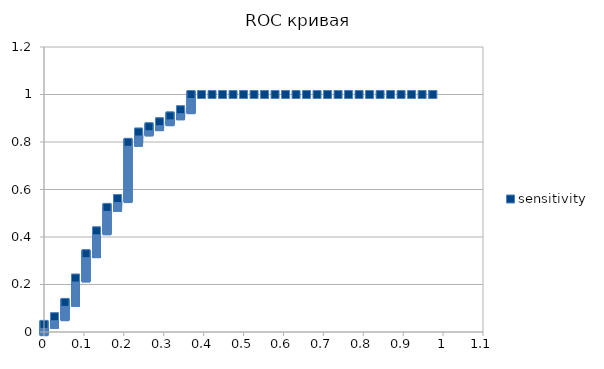
| Category | sensitivity |
|---|---|
| 0.0 | 0.001 |
| 0.0 | 0.002 |
| 0.0 | 0.004 |
| 0.0 | 0.005 |
| 0.0 | 0.006 |
| 0.0 | 0.007 |
| 0.0 | 0.009 |
| 0.0 | 0.01 |
| 0.0 | 0.011 |
| 0.0 | 0.012 |
| 0.0 | 0.014 |
| 0.0 | 0.015 |
| 0.0 | 0.016 |
| 0.0 | 0.017 |
| 0.0 | 0.019 |
| 0.0 | 0.02 |
| 0.0 | 0.021 |
| 0.0 | 0.022 |
| 0.0 | 0.023 |
| 0.0 | 0.025 |
| 0.0 | 0.026 |
| 0.0 | 0.027 |
| 0.0 | 0.028 |
| 0.0 | 0.03 |
| 0.0 | 0.031 |
| 0.0 | 0.032 |
| 0.0263157894736842 | 0.032 |
| 0.0263157894736842 | 0.033 |
| 0.0263157894736842 | 0.035 |
| 0.0263157894736842 | 0.036 |
| 0.0263157894736842 | 0.037 |
| 0.0263157894736842 | 0.038 |
| 0.0263157894736842 | 0.04 |
| 0.0263157894736842 | 0.041 |
| 0.0263157894736842 | 0.042 |
| 0.0263157894736842 | 0.043 |
| 0.0263157894736842 | 0.044 |
| 0.0263157894736842 | 0.046 |
| 0.0263157894736842 | 0.047 |
| 0.0263157894736842 | 0.048 |
| 0.0263157894736842 | 0.049 |
| 0.0263157894736842 | 0.051 |
| 0.0263157894736842 | 0.052 |
| 0.0263157894736842 | 0.053 |
| 0.0263157894736842 | 0.054 |
| 0.0263157894736842 | 0.056 |
| 0.0263157894736842 | 0.057 |
| 0.0263157894736842 | 0.058 |
| 0.0263157894736842 | 0.059 |
| 0.0263157894736842 | 0.06 |
| 0.0263157894736842 | 0.062 |
| 0.0263157894736842 | 0.063 |
| 0.0263157894736842 | 0.064 |
| 0.0526315789473685 | 0.064 |
| 0.0526315789473685 | 0.065 |
| 0.0526315789473685 | 0.067 |
| 0.0526315789473685 | 0.068 |
| 0.0526315789473685 | 0.069 |
| 0.0526315789473685 | 0.07 |
| 0.0526315789473685 | 0.072 |
| 0.0526315789473685 | 0.073 |
| 0.0526315789473685 | 0.074 |
| 0.0526315789473685 | 0.075 |
| 0.0526315789473685 | 0.077 |
| 0.0526315789473685 | 0.078 |
| 0.0526315789473685 | 0.079 |
| 0.0526315789473685 | 0.08 |
| 0.0526315789473685 | 0.081 |
| 0.0526315789473685 | 0.083 |
| 0.0526315789473685 | 0.084 |
| 0.0526315789473685 | 0.085 |
| 0.0526315789473685 | 0.086 |
| 0.0526315789473685 | 0.088 |
| 0.0526315789473685 | 0.089 |
| 0.0526315789473685 | 0.09 |
| 0.0526315789473685 | 0.091 |
| 0.0526315789473685 | 0.093 |
| 0.0526315789473685 | 0.094 |
| 0.0526315789473685 | 0.095 |
| 0.0526315789473685 | 0.096 |
| 0.0526315789473685 | 0.098 |
| 0.0526315789473685 | 0.099 |
| 0.0526315789473685 | 0.1 |
| 0.0526315789473685 | 0.101 |
| 0.0526315789473685 | 0.102 |
| 0.0526315789473685 | 0.104 |
| 0.0526315789473685 | 0.105 |
| 0.0526315789473685 | 0.106 |
| 0.0526315789473685 | 0.107 |
| 0.0526315789473685 | 0.109 |
| 0.0526315789473685 | 0.11 |
| 0.0526315789473685 | 0.111 |
| 0.0526315789473685 | 0.112 |
| 0.0526315789473685 | 0.114 |
| 0.0526315789473685 | 0.115 |
| 0.0526315789473685 | 0.116 |
| 0.0526315789473685 | 0.117 |
| 0.0526315789473685 | 0.119 |
| 0.0526315789473685 | 0.12 |
| 0.0526315789473685 | 0.121 |
| 0.0526315789473685 | 0.122 |
| 0.0526315789473685 | 0.123 |
| 0.0526315789473685 | 0.125 |
| 0.0789473684210527 | 0.125 |
| 0.0789473684210527 | 0.126 |
| 0.0789473684210527 | 0.127 |
| 0.0789473684210527 | 0.128 |
| 0.0789473684210527 | 0.13 |
| 0.0789473684210527 | 0.131 |
| 0.0789473684210527 | 0.132 |
| 0.0789473684210527 | 0.133 |
| 0.0789473684210527 | 0.135 |
| 0.0789473684210527 | 0.136 |
| 0.0789473684210527 | 0.137 |
| 0.0789473684210527 | 0.138 |
| 0.0789473684210527 | 0.14 |
| 0.0789473684210527 | 0.141 |
| 0.0789473684210527 | 0.142 |
| 0.0789473684210527 | 0.143 |
| 0.0789473684210527 | 0.144 |
| 0.0789473684210527 | 0.146 |
| 0.0789473684210527 | 0.147 |
| 0.0789473684210527 | 0.148 |
| 0.0789473684210527 | 0.149 |
| 0.0789473684210527 | 0.151 |
| 0.0789473684210527 | 0.152 |
| 0.0789473684210527 | 0.153 |
| 0.0789473684210527 | 0.154 |
| 0.0789473684210527 | 0.156 |
| 0.0789473684210527 | 0.157 |
| 0.0789473684210527 | 0.158 |
| 0.0789473684210527 | 0.159 |
| 0.0789473684210527 | 0.16 |
| 0.0789473684210527 | 0.162 |
| 0.0789473684210527 | 0.163 |
| 0.0789473684210527 | 0.164 |
| 0.0789473684210527 | 0.165 |
| 0.0789473684210527 | 0.167 |
| 0.0789473684210527 | 0.168 |
| 0.0789473684210527 | 0.169 |
| 0.0789473684210527 | 0.17 |
| 0.0789473684210527 | 0.172 |
| 0.0789473684210527 | 0.173 |
| 0.0789473684210527 | 0.174 |
| 0.0789473684210527 | 0.175 |
| 0.0789473684210527 | 0.177 |
| 0.0789473684210527 | 0.178 |
| 0.0789473684210527 | 0.179 |
| 0.0789473684210527 | 0.18 |
| 0.0789473684210527 | 0.181 |
| 0.0789473684210527 | 0.183 |
| 0.0789473684210527 | 0.184 |
| 0.0789473684210527 | 0.185 |
| 0.0789473684210527 | 0.186 |
| 0.0789473684210527 | 0.188 |
| 0.0789473684210527 | 0.189 |
| 0.0789473684210527 | 0.19 |
| 0.0789473684210527 | 0.191 |
| 0.0789473684210527 | 0.193 |
| 0.0789473684210527 | 0.194 |
| 0.0789473684210527 | 0.195 |
| 0.0789473684210527 | 0.196 |
| 0.0789473684210527 | 0.198 |
| 0.0789473684210527 | 0.199 |
| 0.0789473684210527 | 0.2 |
| 0.0789473684210527 | 0.201 |
| 0.0789473684210527 | 0.202 |
| 0.0789473684210527 | 0.204 |
| 0.0789473684210527 | 0.205 |
| 0.0789473684210527 | 0.206 |
| 0.0789473684210527 | 0.207 |
| 0.0789473684210527 | 0.209 |
| 0.0789473684210527 | 0.21 |
| 0.0789473684210527 | 0.211 |
| 0.0789473684210527 | 0.212 |
| 0.0789473684210527 | 0.214 |
| 0.0789473684210527 | 0.215 |
| 0.0789473684210527 | 0.216 |
| 0.0789473684210527 | 0.217 |
| 0.0789473684210527 | 0.219 |
| 0.0789473684210527 | 0.22 |
| 0.0789473684210527 | 0.221 |
| 0.0789473684210527 | 0.222 |
| 0.0789473684210527 | 0.223 |
| 0.0789473684210527 | 0.225 |
| 0.0789473684210527 | 0.226 |
| 0.0789473684210527 | 0.227 |
| 0.105263157894737 | 0.227 |
| 0.105263157894737 | 0.228 |
| 0.105263157894737 | 0.23 |
| 0.105263157894737 | 0.231 |
| 0.105263157894737 | 0.232 |
| 0.105263157894737 | 0.233 |
| 0.105263157894737 | 0.235 |
| 0.105263157894737 | 0.236 |
| 0.105263157894737 | 0.237 |
| 0.105263157894737 | 0.238 |
| 0.105263157894737 | 0.24 |
| 0.105263157894737 | 0.241 |
| 0.105263157894737 | 0.242 |
| 0.105263157894737 | 0.243 |
| 0.105263157894737 | 0.244 |
| 0.105263157894737 | 0.246 |
| 0.105263157894737 | 0.247 |
| 0.105263157894737 | 0.248 |
| 0.105263157894737 | 0.249 |
| 0.105263157894737 | 0.251 |
| 0.105263157894737 | 0.252 |
| 0.105263157894737 | 0.253 |
| 0.105263157894737 | 0.254 |
| 0.105263157894737 | 0.256 |
| 0.105263157894737 | 0.257 |
| 0.105263157894737 | 0.258 |
| 0.105263157894737 | 0.259 |
| 0.105263157894737 | 0.26 |
| 0.105263157894737 | 0.262 |
| 0.105263157894737 | 0.263 |
| 0.105263157894737 | 0.264 |
| 0.105263157894737 | 0.265 |
| 0.105263157894737 | 0.267 |
| 0.105263157894737 | 0.268 |
| 0.105263157894737 | 0.269 |
| 0.105263157894737 | 0.27 |
| 0.105263157894737 | 0.272 |
| 0.105263157894737 | 0.273 |
| 0.105263157894737 | 0.274 |
| 0.105263157894737 | 0.275 |
| 0.105263157894737 | 0.277 |
| 0.105263157894737 | 0.278 |
| 0.105263157894737 | 0.279 |
| 0.105263157894737 | 0.28 |
| 0.105263157894737 | 0.281 |
| 0.105263157894737 | 0.283 |
| 0.105263157894737 | 0.284 |
| 0.105263157894737 | 0.285 |
| 0.105263157894737 | 0.286 |
| 0.105263157894737 | 0.288 |
| 0.105263157894737 | 0.289 |
| 0.105263157894737 | 0.29 |
| 0.105263157894737 | 0.291 |
| 0.105263157894737 | 0.293 |
| 0.105263157894737 | 0.294 |
| 0.105263157894737 | 0.295 |
| 0.105263157894737 | 0.296 |
| 0.105263157894737 | 0.298 |
| 0.105263157894737 | 0.299 |
| 0.105263157894737 | 0.3 |
| 0.105263157894737 | 0.301 |
| 0.105263157894737 | 0.302 |
| 0.105263157894737 | 0.304 |
| 0.105263157894737 | 0.305 |
| 0.105263157894737 | 0.306 |
| 0.105263157894737 | 0.307 |
| 0.105263157894737 | 0.309 |
| 0.105263157894737 | 0.31 |
| 0.105263157894737 | 0.311 |
| 0.105263157894737 | 0.312 |
| 0.105263157894737 | 0.314 |
| 0.105263157894737 | 0.315 |
| 0.105263157894737 | 0.316 |
| 0.105263157894737 | 0.317 |
| 0.105263157894737 | 0.319 |
| 0.105263157894737 | 0.32 |
| 0.105263157894737 | 0.321 |
| 0.105263157894737 | 0.322 |
| 0.105263157894737 | 0.323 |
| 0.105263157894737 | 0.325 |
| 0.105263157894737 | 0.326 |
| 0.105263157894737 | 0.327 |
| 0.105263157894737 | 0.328 |
| 0.105263157894737 | 0.33 |
| 0.131578947368421 | 0.33 |
| 0.131578947368421 | 0.331 |
| 0.131578947368421 | 0.332 |
| 0.131578947368421 | 0.333 |
| 0.131578947368421 | 0.335 |
| 0.131578947368421 | 0.336 |
| 0.131578947368421 | 0.337 |
| 0.131578947368421 | 0.338 |
| 0.131578947368421 | 0.34 |
| 0.131578947368421 | 0.341 |
| 0.131578947368421 | 0.342 |
| 0.131578947368421 | 0.343 |
| 0.131578947368421 | 0.344 |
| 0.131578947368421 | 0.346 |
| 0.131578947368421 | 0.347 |
| 0.131578947368421 | 0.348 |
| 0.131578947368421 | 0.349 |
| 0.131578947368421 | 0.351 |
| 0.131578947368421 | 0.352 |
| 0.131578947368421 | 0.353 |
| 0.131578947368421 | 0.354 |
| 0.131578947368421 | 0.356 |
| 0.131578947368421 | 0.357 |
| 0.131578947368421 | 0.358 |
| 0.131578947368421 | 0.359 |
| 0.131578947368421 | 0.36 |
| 0.131578947368421 | 0.362 |
| 0.131578947368421 | 0.363 |
| 0.131578947368421 | 0.364 |
| 0.131578947368421 | 0.365 |
| 0.131578947368421 | 0.367 |
| 0.131578947368421 | 0.368 |
| 0.131578947368421 | 0.369 |
| 0.131578947368421 | 0.37 |
| 0.131578947368421 | 0.372 |
| 0.131578947368421 | 0.373 |
| 0.131578947368421 | 0.374 |
| 0.131578947368421 | 0.375 |
| 0.131578947368421 | 0.377 |
| 0.131578947368421 | 0.378 |
| 0.131578947368421 | 0.379 |
| 0.131578947368421 | 0.38 |
| 0.131578947368421 | 0.381 |
| 0.131578947368421 | 0.383 |
| 0.131578947368421 | 0.384 |
| 0.131578947368421 | 0.385 |
| 0.131578947368421 | 0.386 |
| 0.131578947368421 | 0.388 |
| 0.131578947368421 | 0.389 |
| 0.131578947368421 | 0.39 |
| 0.131578947368421 | 0.391 |
| 0.131578947368421 | 0.393 |
| 0.131578947368421 | 0.394 |
| 0.131578947368421 | 0.395 |
| 0.131578947368421 | 0.396 |
| 0.131578947368421 | 0.398 |
| 0.131578947368421 | 0.399 |
| 0.131578947368421 | 0.4 |
| 0.131578947368421 | 0.401 |
| 0.131578947368421 | 0.402 |
| 0.131578947368421 | 0.404 |
| 0.131578947368421 | 0.405 |
| 0.131578947368421 | 0.406 |
| 0.131578947368421 | 0.407 |
| 0.131578947368421 | 0.409 |
| 0.131578947368421 | 0.41 |
| 0.131578947368421 | 0.411 |
| 0.131578947368421 | 0.412 |
| 0.131578947368421 | 0.414 |
| 0.131578947368421 | 0.415 |
| 0.131578947368421 | 0.416 |
| 0.131578947368421 | 0.417 |
| 0.131578947368421 | 0.419 |
| 0.131578947368421 | 0.42 |
| 0.131578947368421 | 0.421 |
| 0.131578947368421 | 0.422 |
| 0.131578947368421 | 0.423 |
| 0.131578947368421 | 0.425 |
| 0.131578947368421 | 0.426 |
| 0.157894736842105 | 0.426 |
| 0.157894736842105 | 0.427 |
| 0.157894736842105 | 0.428 |
| 0.157894736842105 | 0.43 |
| 0.157894736842105 | 0.431 |
| 0.157894736842105 | 0.432 |
| 0.157894736842105 | 0.433 |
| 0.157894736842105 | 0.435 |
| 0.157894736842105 | 0.436 |
| 0.157894736842105 | 0.437 |
| 0.157894736842105 | 0.438 |
| 0.157894736842105 | 0.44 |
| 0.157894736842105 | 0.441 |
| 0.157894736842105 | 0.442 |
| 0.157894736842105 | 0.443 |
| 0.157894736842105 | 0.444 |
| 0.157894736842105 | 0.446 |
| 0.157894736842105 | 0.447 |
| 0.157894736842105 | 0.448 |
| 0.157894736842105 | 0.449 |
| 0.157894736842105 | 0.451 |
| 0.157894736842105 | 0.452 |
| 0.157894736842105 | 0.453 |
| 0.157894736842105 | 0.454 |
| 0.157894736842105 | 0.456 |
| 0.157894736842105 | 0.457 |
| 0.157894736842105 | 0.458 |
| 0.157894736842105 | 0.459 |
| 0.157894736842105 | 0.46 |
| 0.157894736842105 | 0.462 |
| 0.157894736842105 | 0.463 |
| 0.157894736842105 | 0.464 |
| 0.157894736842105 | 0.465 |
| 0.157894736842105 | 0.467 |
| 0.157894736842105 | 0.468 |
| 0.157894736842105 | 0.469 |
| 0.157894736842105 | 0.47 |
| 0.157894736842105 | 0.472 |
| 0.157894736842105 | 0.473 |
| 0.157894736842105 | 0.474 |
| 0.157894736842105 | 0.475 |
| 0.157894736842105 | 0.477 |
| 0.157894736842105 | 0.478 |
| 0.157894736842105 | 0.479 |
| 0.157894736842105 | 0.48 |
| 0.157894736842105 | 0.481 |
| 0.157894736842105 | 0.483 |
| 0.157894736842105 | 0.484 |
| 0.157894736842105 | 0.485 |
| 0.157894736842105 | 0.486 |
| 0.157894736842105 | 0.488 |
| 0.157894736842105 | 0.489 |
| 0.157894736842105 | 0.49 |
| 0.157894736842105 | 0.491 |
| 0.157894736842105 | 0.493 |
| 0.157894736842105 | 0.494 |
| 0.157894736842105 | 0.495 |
| 0.157894736842105 | 0.496 |
| 0.157894736842105 | 0.498 |
| 0.157894736842105 | 0.499 |
| 0.157894736842105 | 0.5 |
| 0.157894736842105 | 0.501 |
| 0.157894736842105 | 0.502 |
| 0.157894736842105 | 0.504 |
| 0.157894736842105 | 0.505 |
| 0.157894736842105 | 0.506 |
| 0.157894736842105 | 0.507 |
| 0.157894736842105 | 0.509 |
| 0.157894736842105 | 0.51 |
| 0.157894736842105 | 0.511 |
| 0.157894736842105 | 0.512 |
| 0.157894736842105 | 0.514 |
| 0.157894736842105 | 0.515 |
| 0.157894736842105 | 0.516 |
| 0.157894736842105 | 0.517 |
| 0.157894736842105 | 0.519 |
| 0.157894736842105 | 0.52 |
| 0.157894736842105 | 0.521 |
| 0.157894736842105 | 0.522 |
| 0.157894736842105 | 0.523 |
| 0.157894736842105 | 0.525 |
| 0.18421052631579 | 0.525 |
| 0.18421052631579 | 0.526 |
| 0.18421052631579 | 0.527 |
| 0.18421052631579 | 0.528 |
| 0.18421052631579 | 0.53 |
| 0.18421052631579 | 0.531 |
| 0.18421052631579 | 0.532 |
| 0.18421052631579 | 0.533 |
| 0.18421052631579 | 0.535 |
| 0.18421052631579 | 0.536 |
| 0.18421052631579 | 0.537 |
| 0.18421052631579 | 0.538 |
| 0.18421052631579 | 0.54 |
| 0.18421052631579 | 0.541 |
| 0.18421052631579 | 0.542 |
| 0.18421052631579 | 0.543 |
| 0.18421052631579 | 0.544 |
| 0.18421052631579 | 0.546 |
| 0.18421052631579 | 0.547 |
| 0.18421052631579 | 0.548 |
| 0.18421052631579 | 0.549 |
| 0.18421052631579 | 0.551 |
| 0.18421052631579 | 0.552 |
| 0.18421052631579 | 0.553 |
| 0.18421052631579 | 0.554 |
| 0.18421052631579 | 0.556 |
| 0.18421052631579 | 0.557 |
| 0.18421052631579 | 0.558 |
| 0.18421052631579 | 0.559 |
| 0.18421052631579 | 0.56 |
| 0.18421052631579 | 0.562 |
| 0.210526315789474 | 0.562 |
| 0.210526315789474 | 0.563 |
| 0.210526315789474 | 0.564 |
| 0.210526315789474 | 0.565 |
| 0.210526315789474 | 0.567 |
| 0.210526315789474 | 0.568 |
| 0.210526315789474 | 0.569 |
| 0.210526315789474 | 0.57 |
| 0.210526315789474 | 0.572 |
| 0.210526315789474 | 0.573 |
| 0.210526315789474 | 0.574 |
| 0.210526315789474 | 0.575 |
| 0.210526315789474 | 0.577 |
| 0.210526315789474 | 0.578 |
| 0.210526315789474 | 0.579 |
| 0.210526315789474 | 0.58 |
| 0.210526315789474 | 0.581 |
| 0.210526315789474 | 0.583 |
| 0.210526315789474 | 0.584 |
| 0.210526315789474 | 0.585 |
| 0.210526315789474 | 0.586 |
| 0.210526315789474 | 0.588 |
| 0.210526315789474 | 0.589 |
| 0.210526315789474 | 0.59 |
| 0.210526315789474 | 0.591 |
| 0.210526315789474 | 0.593 |
| 0.210526315789474 | 0.594 |
| 0.210526315789474 | 0.595 |
| 0.210526315789474 | 0.596 |
| 0.210526315789474 | 0.598 |
| 0.210526315789474 | 0.599 |
| 0.210526315789474 | 0.6 |
| 0.210526315789474 | 0.601 |
| 0.210526315789474 | 0.602 |
| 0.210526315789474 | 0.604 |
| 0.210526315789474 | 0.605 |
| 0.210526315789474 | 0.606 |
| 0.210526315789474 | 0.607 |
| 0.210526315789474 | 0.609 |
| 0.210526315789474 | 0.61 |
| 0.210526315789474 | 0.611 |
| 0.210526315789474 | 0.612 |
| 0.210526315789474 | 0.614 |
| 0.210526315789474 | 0.615 |
| 0.210526315789474 | 0.616 |
| 0.210526315789474 | 0.617 |
| 0.210526315789474 | 0.619 |
| 0.210526315789474 | 0.62 |
| 0.210526315789474 | 0.621 |
| 0.210526315789474 | 0.622 |
| 0.210526315789474 | 0.623 |
| 0.210526315789474 | 0.625 |
| 0.210526315789474 | 0.626 |
| 0.210526315789474 | 0.627 |
| 0.210526315789474 | 0.628 |
| 0.210526315789474 | 0.63 |
| 0.210526315789474 | 0.631 |
| 0.210526315789474 | 0.632 |
| 0.210526315789474 | 0.633 |
| 0.210526315789474 | 0.635 |
| 0.210526315789474 | 0.636 |
| 0.210526315789474 | 0.637 |
| 0.210526315789474 | 0.638 |
| 0.210526315789474 | 0.64 |
| 0.210526315789474 | 0.641 |
| 0.210526315789474 | 0.642 |
| 0.210526315789474 | 0.643 |
| 0.210526315789474 | 0.644 |
| 0.210526315789474 | 0.646 |
| 0.210526315789474 | 0.647 |
| 0.210526315789474 | 0.648 |
| 0.210526315789474 | 0.649 |
| 0.210526315789474 | 0.651 |
| 0.210526315789474 | 0.652 |
| 0.210526315789474 | 0.653 |
| 0.210526315789474 | 0.654 |
| 0.210526315789474 | 0.656 |
| 0.210526315789474 | 0.657 |
| 0.210526315789474 | 0.658 |
| 0.210526315789474 | 0.659 |
| 0.210526315789474 | 0.66 |
| 0.210526315789474 | 0.662 |
| 0.210526315789474 | 0.663 |
| 0.210526315789474 | 0.664 |
| 0.210526315789474 | 0.665 |
| 0.210526315789474 | 0.667 |
| 0.210526315789474 | 0.668 |
| 0.210526315789474 | 0.669 |
| 0.210526315789474 | 0.67 |
| 0.210526315789474 | 0.672 |
| 0.210526315789474 | 0.673 |
| 0.210526315789474 | 0.674 |
| 0.210526315789474 | 0.675 |
| 0.210526315789474 | 0.677 |
| 0.210526315789474 | 0.678 |
| 0.210526315789474 | 0.679 |
| 0.210526315789474 | 0.68 |
| 0.210526315789474 | 0.681 |
| 0.210526315789474 | 0.683 |
| 0.210526315789474 | 0.684 |
| 0.210526315789474 | 0.685 |
| 0.210526315789474 | 0.686 |
| 0.210526315789474 | 0.688 |
| 0.210526315789474 | 0.689 |
| 0.210526315789474 | 0.69 |
| 0.210526315789474 | 0.691 |
| 0.210526315789474 | 0.693 |
| 0.210526315789474 | 0.694 |
| 0.210526315789474 | 0.695 |
| 0.210526315789474 | 0.696 |
| 0.210526315789474 | 0.698 |
| 0.210526315789474 | 0.699 |
| 0.210526315789474 | 0.7 |
| 0.210526315789474 | 0.701 |
| 0.210526315789474 | 0.702 |
| 0.210526315789474 | 0.704 |
| 0.210526315789474 | 0.705 |
| 0.210526315789474 | 0.706 |
| 0.210526315789474 | 0.707 |
| 0.210526315789474 | 0.709 |
| 0.210526315789474 | 0.71 |
| 0.210526315789474 | 0.711 |
| 0.210526315789474 | 0.712 |
| 0.210526315789474 | 0.714 |
| 0.210526315789474 | 0.715 |
| 0.210526315789474 | 0.716 |
| 0.210526315789474 | 0.717 |
| 0.210526315789474 | 0.719 |
| 0.210526315789474 | 0.72 |
| 0.210526315789474 | 0.721 |
| 0.210526315789474 | 0.722 |
| 0.210526315789474 | 0.723 |
| 0.210526315789474 | 0.725 |
| 0.210526315789474 | 0.726 |
| 0.210526315789474 | 0.727 |
| 0.210526315789474 | 0.728 |
| 0.210526315789474 | 0.73 |
| 0.210526315789474 | 0.731 |
| 0.210526315789474 | 0.732 |
| 0.210526315789474 | 0.733 |
| 0.210526315789474 | 0.735 |
| 0.210526315789474 | 0.736 |
| 0.210526315789474 | 0.737 |
| 0.210526315789474 | 0.738 |
| 0.210526315789474 | 0.74 |
| 0.210526315789474 | 0.741 |
| 0.210526315789474 | 0.742 |
| 0.210526315789474 | 0.743 |
| 0.210526315789474 | 0.744 |
| 0.210526315789474 | 0.746 |
| 0.210526315789474 | 0.747 |
| 0.210526315789474 | 0.748 |
| 0.210526315789474 | 0.749 |
| 0.210526315789474 | 0.751 |
| 0.210526315789474 | 0.752 |
| 0.210526315789474 | 0.753 |
| 0.210526315789474 | 0.754 |
| 0.210526315789474 | 0.756 |
| 0.210526315789474 | 0.757 |
| 0.210526315789474 | 0.758 |
| 0.210526315789474 | 0.759 |
| 0.210526315789474 | 0.76 |
| 0.210526315789474 | 0.762 |
| 0.210526315789474 | 0.763 |
| 0.210526315789474 | 0.764 |
| 0.210526315789474 | 0.765 |
| 0.210526315789474 | 0.767 |
| 0.210526315789474 | 0.768 |
| 0.210526315789474 | 0.769 |
| 0.210526315789474 | 0.77 |
| 0.210526315789474 | 0.772 |
| 0.210526315789474 | 0.773 |
| 0.210526315789474 | 0.774 |
| 0.210526315789474 | 0.775 |
| 0.210526315789474 | 0.777 |
| 0.210526315789474 | 0.778 |
| 0.210526315789474 | 0.779 |
| 0.210526315789474 | 0.78 |
| 0.210526315789474 | 0.781 |
| 0.210526315789474 | 0.783 |
| 0.210526315789474 | 0.784 |
| 0.210526315789474 | 0.785 |
| 0.210526315789474 | 0.786 |
| 0.210526315789474 | 0.788 |
| 0.210526315789474 | 0.789 |
| 0.210526315789474 | 0.79 |
| 0.210526315789474 | 0.791 |
| 0.210526315789474 | 0.793 |
| 0.210526315789474 | 0.794 |
| 0.210526315789474 | 0.795 |
| 0.210526315789474 | 0.796 |
| 0.210526315789474 | 0.798 |
| 0.210526315789474 | 0.799 |
| 0.236842105263158 | 0.799 |
| 0.236842105263158 | 0.8 |
| 0.236842105263158 | 0.801 |
| 0.236842105263158 | 0.802 |
| 0.236842105263158 | 0.804 |
| 0.236842105263158 | 0.805 |
| 0.236842105263158 | 0.806 |
| 0.236842105263158 | 0.807 |
| 0.236842105263158 | 0.809 |
| 0.236842105263158 | 0.81 |
| 0.236842105263158 | 0.811 |
| 0.236842105263158 | 0.812 |
| 0.236842105263158 | 0.814 |
| 0.236842105263158 | 0.815 |
| 0.236842105263158 | 0.816 |
| 0.236842105263158 | 0.817 |
| 0.236842105263158 | 0.819 |
| 0.236842105263158 | 0.82 |
| 0.236842105263158 | 0.821 |
| 0.236842105263158 | 0.822 |
| 0.236842105263158 | 0.823 |
| 0.236842105263158 | 0.825 |
| 0.236842105263158 | 0.826 |
| 0.236842105263158 | 0.827 |
| 0.236842105263158 | 0.828 |
| 0.236842105263158 | 0.83 |
| 0.236842105263158 | 0.831 |
| 0.236842105263158 | 0.832 |
| 0.236842105263158 | 0.833 |
| 0.236842105263158 | 0.835 |
| 0.236842105263158 | 0.836 |
| 0.236842105263158 | 0.837 |
| 0.236842105263158 | 0.838 |
| 0.236842105263158 | 0.84 |
| 0.236842105263158 | 0.841 |
| 0.236842105263158 | 0.842 |
| 0.263157894736842 | 0.842 |
| 0.263157894736842 | 0.843 |
| 0.263157894736842 | 0.844 |
| 0.263157894736842 | 0.846 |
| 0.263157894736842 | 0.847 |
| 0.263157894736842 | 0.848 |
| 0.263157894736842 | 0.849 |
| 0.263157894736842 | 0.851 |
| 0.263157894736842 | 0.852 |
| 0.263157894736842 | 0.853 |
| 0.263157894736842 | 0.854 |
| 0.263157894736842 | 0.856 |
| 0.263157894736842 | 0.857 |
| 0.263157894736842 | 0.858 |
| 0.263157894736842 | 0.859 |
| 0.263157894736842 | 0.86 |
| 0.263157894736842 | 0.862 |
| 0.263157894736842 | 0.863 |
| 0.263157894736842 | 0.864 |
| 0.289473684210526 | 0.864 |
| 0.289473684210526 | 0.865 |
| 0.289473684210526 | 0.867 |
| 0.289473684210526 | 0.868 |
| 0.289473684210526 | 0.869 |
| 0.289473684210526 | 0.87 |
| 0.289473684210526 | 0.872 |
| 0.289473684210526 | 0.873 |
| 0.289473684210526 | 0.874 |
| 0.289473684210526 | 0.875 |
| 0.289473684210526 | 0.877 |
| 0.289473684210526 | 0.878 |
| 0.289473684210526 | 0.879 |
| 0.289473684210526 | 0.88 |
| 0.289473684210526 | 0.881 |
| 0.289473684210526 | 0.883 |
| 0.289473684210526 | 0.884 |
| 0.289473684210526 | 0.885 |
| 0.31578947368421 | 0.885 |
| 0.31578947368421 | 0.886 |
| 0.31578947368421 | 0.888 |
| 0.31578947368421 | 0.889 |
| 0.31578947368421 | 0.89 |
| 0.31578947368421 | 0.891 |
| 0.31578947368421 | 0.893 |
| 0.31578947368421 | 0.894 |
| 0.31578947368421 | 0.895 |
| 0.31578947368421 | 0.896 |
| 0.31578947368421 | 0.898 |
| 0.31578947368421 | 0.899 |
| 0.31578947368421 | 0.9 |
| 0.31578947368421 | 0.901 |
| 0.31578947368421 | 0.902 |
| 0.31578947368421 | 0.904 |
| 0.31578947368421 | 0.905 |
| 0.31578947368421 | 0.906 |
| 0.31578947368421 | 0.907 |
| 0.31578947368421 | 0.909 |
| 0.31578947368421 | 0.91 |
| 0.342105263157895 | 0.91 |
| 0.342105263157895 | 0.911 |
| 0.342105263157895 | 0.912 |
| 0.342105263157895 | 0.914 |
| 0.342105263157895 | 0.915 |
| 0.342105263157895 | 0.916 |
| 0.342105263157895 | 0.917 |
| 0.342105263157895 | 0.919 |
| 0.342105263157895 | 0.92 |
| 0.342105263157895 | 0.921 |
| 0.342105263157895 | 0.922 |
| 0.342105263157895 | 0.923 |
| 0.342105263157895 | 0.925 |
| 0.342105263157895 | 0.926 |
| 0.342105263157895 | 0.927 |
| 0.342105263157895 | 0.928 |
| 0.342105263157895 | 0.93 |
| 0.342105263157895 | 0.931 |
| 0.342105263157895 | 0.932 |
| 0.342105263157895 | 0.933 |
| 0.342105263157895 | 0.935 |
| 0.342105263157895 | 0.936 |
| 0.368421052631579 | 0.936 |
| 0.368421052631579 | 0.937 |
| 0.368421052631579 | 0.938 |
| 0.368421052631579 | 0.94 |
| 0.368421052631579 | 0.941 |
| 0.368421052631579 | 0.942 |
| 0.368421052631579 | 0.943 |
| 0.368421052631579 | 0.944 |
| 0.368421052631579 | 0.946 |
| 0.368421052631579 | 0.947 |
| 0.368421052631579 | 0.948 |
| 0.368421052631579 | 0.949 |
| 0.368421052631579 | 0.951 |
| 0.368421052631579 | 0.952 |
| 0.368421052631579 | 0.953 |
| 0.368421052631579 | 0.954 |
| 0.368421052631579 | 0.956 |
| 0.368421052631579 | 0.957 |
| 0.368421052631579 | 0.958 |
| 0.368421052631579 | 0.959 |
| 0.368421052631579 | 0.96 |
| 0.368421052631579 | 0.962 |
| 0.368421052631579 | 0.963 |
| 0.368421052631579 | 0.964 |
| 0.368421052631579 | 0.965 |
| 0.368421052631579 | 0.967 |
| 0.368421052631579 | 0.968 |
| 0.368421052631579 | 0.969 |
| 0.368421052631579 | 0.97 |
| 0.368421052631579 | 0.972 |
| 0.368421052631579 | 0.973 |
| 0.368421052631579 | 0.974 |
| 0.368421052631579 | 0.975 |
| 0.368421052631579 | 0.977 |
| 0.368421052631579 | 0.978 |
| 0.368421052631579 | 0.979 |
| 0.368421052631579 | 0.98 |
| 0.368421052631579 | 0.981 |
| 0.368421052631579 | 0.983 |
| 0.368421052631579 | 0.984 |
| 0.368421052631579 | 0.985 |
| 0.368421052631579 | 0.986 |
| 0.368421052631579 | 0.988 |
| 0.368421052631579 | 0.989 |
| 0.368421052631579 | 0.99 |
| 0.368421052631579 | 0.991 |
| 0.368421052631579 | 0.993 |
| 0.368421052631579 | 0.994 |
| 0.368421052631579 | 0.995 |
| 0.368421052631579 | 0.996 |
| 0.368421052631579 | 0.998 |
| 0.368421052631579 | 0.999 |
| 0.368421052631579 | 1 |
| 0.394736842105263 | 1 |
| 0.421052631578947 | 1 |
| 0.447368421052632 | 1 |
| 0.473684210526316 | 1 |
| 0.5 | 1 |
| 0.526315789473684 | 1 |
| 0.552631578947368 | 1 |
| 0.578947368421053 | 1 |
| 0.605263157894737 | 1 |
| 0.631578947368421 | 1 |
| 0.657894736842105 | 1 |
| 0.68421052631579 | 1 |
| 0.710526315789474 | 1 |
| 0.736842105263158 | 1 |
| 0.763157894736842 | 1 |
| 0.789473684210526 | 1 |
| 0.81578947368421 | 1 |
| 0.842105263157895 | 1 |
| 0.868421052631579 | 1 |
| 0.894736842105263 | 1 |
| 0.921052631578947 | 1 |
| 0.947368421052632 | 1 |
| 0.973684210526316 | 1 |
| 0.974358974358974 | 1 |